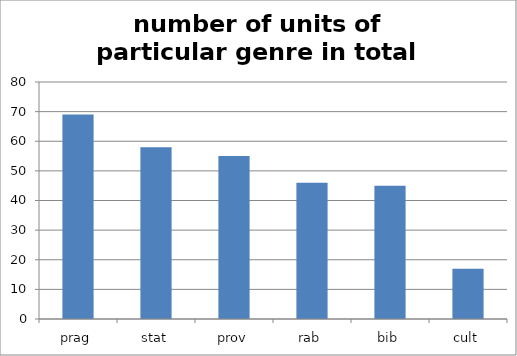
| Category | Series 0 |
|---|---|
| prag | 69 |
| stat | 58 |
| prov | 55 |
| rab | 46 |
| bib | 45 |
| cult | 17 |